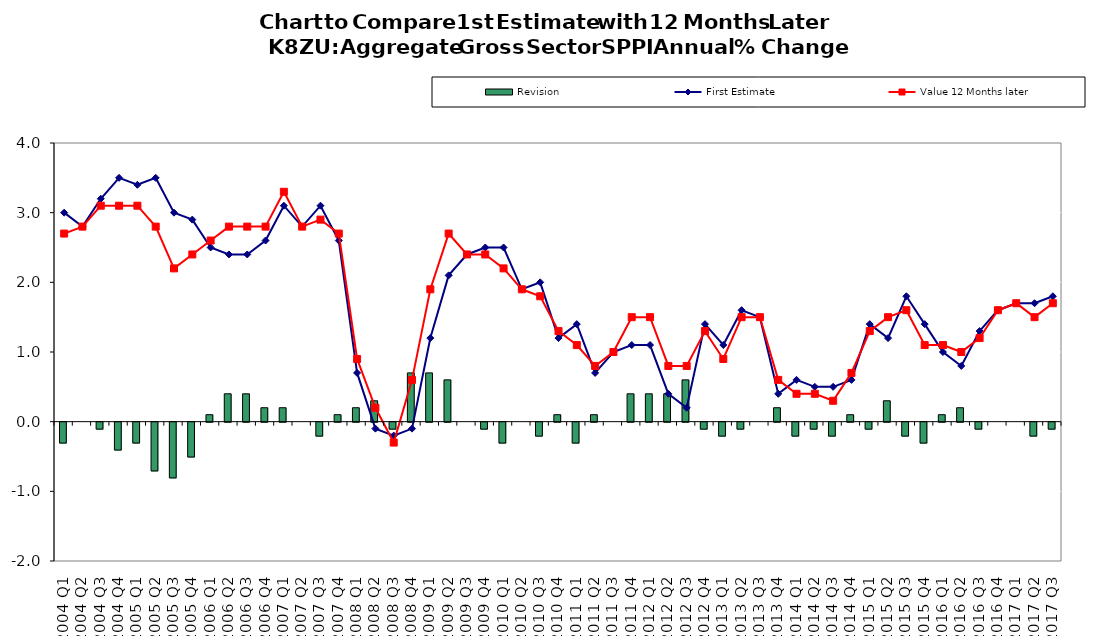
| Category | Revision |
|---|---|
| 2004 Q1 | -0.3 |
| 2004 Q2 | 0 |
| 2004 Q3 | -0.1 |
| 2004 Q4 | -0.4 |
| 2005 Q1 | -0.3 |
| 2005 Q2 | -0.7 |
| 2005 Q3 | -0.8 |
| 2005 Q4 | -0.5 |
| 2006 Q1 | 0.1 |
| 2006 Q2 | 0.4 |
| 2006 Q3 | 0.4 |
| 2006 Q4 | 0.2 |
| 2007 Q1 | 0.2 |
| 2007 Q2 | 0 |
| 2007 Q3 | -0.2 |
| 2007 Q4 | 0.1 |
| 2008 Q1 | 0.2 |
| 2008 Q2 | 0.3 |
| 2008 Q3 | -0.1 |
| 2008 Q4 | 0.7 |
| 2009 Q1 | 0.7 |
| 2009 Q2 | 0.6 |
| 2009 Q3 | 0 |
| 2009 Q4 | -0.1 |
| 2010 Q1 | -0.3 |
| 2010 Q2 | 0 |
| 2010 Q3 | -0.2 |
| 2010 Q4 | 0.1 |
| 2011 Q1 | -0.3 |
| 2011 Q2 | 0.1 |
| 2011 Q3 | 0 |
| 2011 Q4 | 0.4 |
| 2012 Q1 | 0.4 |
| 2012 Q2 | 0.4 |
| 2012 Q3 | 0.6 |
| 2012 Q4 | -0.1 |
| 2013 Q1 | -0.2 |
| 2013 Q2 | -0.1 |
| 2013 Q3 | 0 |
| 2013 Q4 | 0.2 |
| 2014 Q1 | -0.2 |
| 2014 Q2 | -0.1 |
| 2014 Q3 | -0.2 |
| 2014 Q4 | 0.1 |
| 2015 Q1 | -0.1 |
| 2015 Q2 | 0.3 |
| 2015 Q3 | -0.2 |
| 2015 Q4 | -0.3 |
| 2016 Q1 | 0.1 |
| 2016 Q2 | 0.2 |
| 2016 Q3 | -0.1 |
| 2016 Q4 | 0 |
| 2017 Q1 | 0 |
| 2017 Q2 | -0.2 |
| 2017 Q3 | -0.1 |